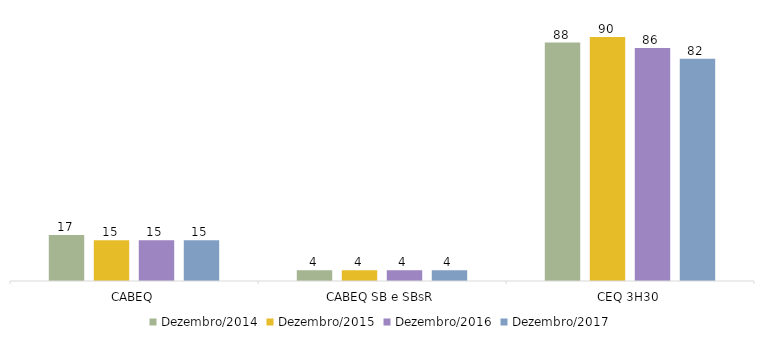
| Category | Dezembro/2014 | Dezembro/2015 | Dezembro/2016 | Dezembro/2017 |
|---|---|---|---|---|
| CABEQ | 17 | 15 | 15 | 15 |
| CABEQ SB e SBsR | 4 | 4 | 4 | 4 |
| CEQ 3H30 | 88 | 90 | 86 | 82 |